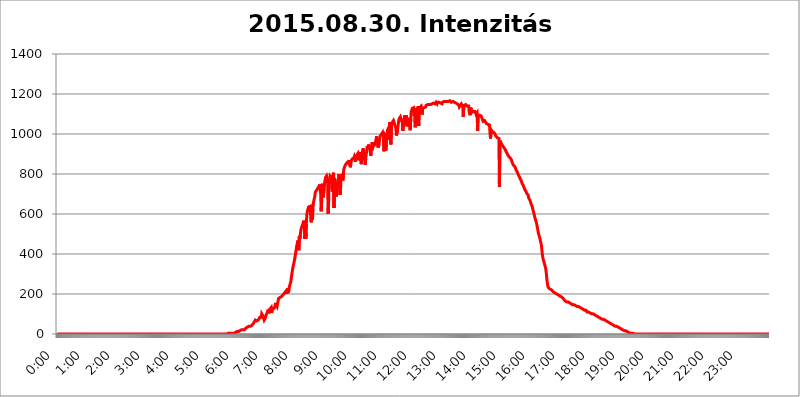
| Category | 2015.08.30. Intenzitás [W/m^2] |
|---|---|
| 0.0 | 0 |
| 0.0006944444444444445 | 0 |
| 0.001388888888888889 | 0 |
| 0.0020833333333333333 | 0 |
| 0.002777777777777778 | 0 |
| 0.003472222222222222 | 0 |
| 0.004166666666666667 | 0 |
| 0.004861111111111111 | 0 |
| 0.005555555555555556 | 0 |
| 0.0062499999999999995 | 0 |
| 0.006944444444444444 | 0 |
| 0.007638888888888889 | 0 |
| 0.008333333333333333 | 0 |
| 0.009027777777777779 | 0 |
| 0.009722222222222222 | 0 |
| 0.010416666666666666 | 0 |
| 0.011111111111111112 | 0 |
| 0.011805555555555555 | 0 |
| 0.012499999999999999 | 0 |
| 0.013194444444444444 | 0 |
| 0.013888888888888888 | 0 |
| 0.014583333333333332 | 0 |
| 0.015277777777777777 | 0 |
| 0.015972222222222224 | 0 |
| 0.016666666666666666 | 0 |
| 0.017361111111111112 | 0 |
| 0.018055555555555557 | 0 |
| 0.01875 | 0 |
| 0.019444444444444445 | 0 |
| 0.02013888888888889 | 0 |
| 0.020833333333333332 | 0 |
| 0.02152777777777778 | 0 |
| 0.022222222222222223 | 0 |
| 0.02291666666666667 | 0 |
| 0.02361111111111111 | 0 |
| 0.024305555555555556 | 0 |
| 0.024999999999999998 | 0 |
| 0.025694444444444447 | 0 |
| 0.02638888888888889 | 0 |
| 0.027083333333333334 | 0 |
| 0.027777777777777776 | 0 |
| 0.02847222222222222 | 0 |
| 0.029166666666666664 | 0 |
| 0.029861111111111113 | 0 |
| 0.030555555555555555 | 0 |
| 0.03125 | 0 |
| 0.03194444444444445 | 0 |
| 0.03263888888888889 | 0 |
| 0.03333333333333333 | 0 |
| 0.034027777777777775 | 0 |
| 0.034722222222222224 | 0 |
| 0.035416666666666666 | 0 |
| 0.036111111111111115 | 0 |
| 0.03680555555555556 | 0 |
| 0.0375 | 0 |
| 0.03819444444444444 | 0 |
| 0.03888888888888889 | 0 |
| 0.03958333333333333 | 0 |
| 0.04027777777777778 | 0 |
| 0.04097222222222222 | 0 |
| 0.041666666666666664 | 0 |
| 0.042361111111111106 | 0 |
| 0.04305555555555556 | 0 |
| 0.043750000000000004 | 0 |
| 0.044444444444444446 | 0 |
| 0.04513888888888889 | 0 |
| 0.04583333333333334 | 0 |
| 0.04652777777777778 | 0 |
| 0.04722222222222222 | 0 |
| 0.04791666666666666 | 0 |
| 0.04861111111111111 | 0 |
| 0.049305555555555554 | 0 |
| 0.049999999999999996 | 0 |
| 0.05069444444444445 | 0 |
| 0.051388888888888894 | 0 |
| 0.052083333333333336 | 0 |
| 0.05277777777777778 | 0 |
| 0.05347222222222222 | 0 |
| 0.05416666666666667 | 0 |
| 0.05486111111111111 | 0 |
| 0.05555555555555555 | 0 |
| 0.05625 | 0 |
| 0.05694444444444444 | 0 |
| 0.057638888888888885 | 0 |
| 0.05833333333333333 | 0 |
| 0.05902777777777778 | 0 |
| 0.059722222222222225 | 0 |
| 0.06041666666666667 | 0 |
| 0.061111111111111116 | 0 |
| 0.06180555555555556 | 0 |
| 0.0625 | 0 |
| 0.06319444444444444 | 0 |
| 0.06388888888888888 | 0 |
| 0.06458333333333334 | 0 |
| 0.06527777777777778 | 0 |
| 0.06597222222222222 | 0 |
| 0.06666666666666667 | 0 |
| 0.06736111111111111 | 0 |
| 0.06805555555555555 | 0 |
| 0.06874999999999999 | 0 |
| 0.06944444444444443 | 0 |
| 0.07013888888888889 | 0 |
| 0.07083333333333333 | 0 |
| 0.07152777777777779 | 0 |
| 0.07222222222222223 | 0 |
| 0.07291666666666667 | 0 |
| 0.07361111111111111 | 0 |
| 0.07430555555555556 | 0 |
| 0.075 | 0 |
| 0.07569444444444444 | 0 |
| 0.0763888888888889 | 0 |
| 0.07708333333333334 | 0 |
| 0.07777777777777778 | 0 |
| 0.07847222222222222 | 0 |
| 0.07916666666666666 | 0 |
| 0.0798611111111111 | 0 |
| 0.08055555555555556 | 0 |
| 0.08125 | 0 |
| 0.08194444444444444 | 0 |
| 0.08263888888888889 | 0 |
| 0.08333333333333333 | 0 |
| 0.08402777777777777 | 0 |
| 0.08472222222222221 | 0 |
| 0.08541666666666665 | 0 |
| 0.08611111111111112 | 0 |
| 0.08680555555555557 | 0 |
| 0.08750000000000001 | 0 |
| 0.08819444444444445 | 0 |
| 0.08888888888888889 | 0 |
| 0.08958333333333333 | 0 |
| 0.09027777777777778 | 0 |
| 0.09097222222222222 | 0 |
| 0.09166666666666667 | 0 |
| 0.09236111111111112 | 0 |
| 0.09305555555555556 | 0 |
| 0.09375 | 0 |
| 0.09444444444444444 | 0 |
| 0.09513888888888888 | 0 |
| 0.09583333333333333 | 0 |
| 0.09652777777777777 | 0 |
| 0.09722222222222222 | 0 |
| 0.09791666666666667 | 0 |
| 0.09861111111111111 | 0 |
| 0.09930555555555555 | 0 |
| 0.09999999999999999 | 0 |
| 0.10069444444444443 | 0 |
| 0.1013888888888889 | 0 |
| 0.10208333333333335 | 0 |
| 0.10277777777777779 | 0 |
| 0.10347222222222223 | 0 |
| 0.10416666666666667 | 0 |
| 0.10486111111111111 | 0 |
| 0.10555555555555556 | 0 |
| 0.10625 | 0 |
| 0.10694444444444444 | 0 |
| 0.1076388888888889 | 0 |
| 0.10833333333333334 | 0 |
| 0.10902777777777778 | 0 |
| 0.10972222222222222 | 0 |
| 0.1111111111111111 | 0 |
| 0.11180555555555556 | 0 |
| 0.11180555555555556 | 0 |
| 0.1125 | 0 |
| 0.11319444444444444 | 0 |
| 0.11388888888888889 | 0 |
| 0.11458333333333333 | 0 |
| 0.11527777777777777 | 0 |
| 0.11597222222222221 | 0 |
| 0.11666666666666665 | 0 |
| 0.1173611111111111 | 0 |
| 0.11805555555555557 | 0 |
| 0.11944444444444445 | 0 |
| 0.12013888888888889 | 0 |
| 0.12083333333333333 | 0 |
| 0.12152777777777778 | 0 |
| 0.12222222222222223 | 0 |
| 0.12291666666666667 | 0 |
| 0.12291666666666667 | 0 |
| 0.12361111111111112 | 0 |
| 0.12430555555555556 | 0 |
| 0.125 | 0 |
| 0.12569444444444444 | 0 |
| 0.12638888888888888 | 0 |
| 0.12708333333333333 | 0 |
| 0.16875 | 0 |
| 0.12847222222222224 | 0 |
| 0.12916666666666668 | 0 |
| 0.12986111111111112 | 0 |
| 0.13055555555555556 | 0 |
| 0.13125 | 0 |
| 0.13194444444444445 | 0 |
| 0.1326388888888889 | 0 |
| 0.13333333333333333 | 0 |
| 0.13402777777777777 | 0 |
| 0.13402777777777777 | 0 |
| 0.13472222222222222 | 0 |
| 0.13541666666666666 | 0 |
| 0.1361111111111111 | 0 |
| 0.13749999999999998 | 0 |
| 0.13819444444444443 | 0 |
| 0.1388888888888889 | 0 |
| 0.13958333333333334 | 0 |
| 0.14027777777777778 | 0 |
| 0.14097222222222222 | 0 |
| 0.14166666666666666 | 0 |
| 0.1423611111111111 | 0 |
| 0.14305555555555557 | 0 |
| 0.14375000000000002 | 0 |
| 0.14444444444444446 | 0 |
| 0.1451388888888889 | 0 |
| 0.1451388888888889 | 0 |
| 0.14652777777777778 | 0 |
| 0.14722222222222223 | 0 |
| 0.14791666666666667 | 0 |
| 0.1486111111111111 | 0 |
| 0.14930555555555555 | 0 |
| 0.15 | 0 |
| 0.15069444444444444 | 0 |
| 0.15138888888888888 | 0 |
| 0.15208333333333332 | 0 |
| 0.15277777777777776 | 0 |
| 0.15347222222222223 | 0 |
| 0.15416666666666667 | 0 |
| 0.15486111111111112 | 0 |
| 0.15555555555555556 | 0 |
| 0.15625 | 0 |
| 0.15694444444444444 | 0 |
| 0.15763888888888888 | 0 |
| 0.15833333333333333 | 0 |
| 0.15902777777777777 | 0 |
| 0.15972222222222224 | 0 |
| 0.16041666666666668 | 0 |
| 0.16111111111111112 | 0 |
| 0.16180555555555556 | 0 |
| 0.1625 | 0 |
| 0.16319444444444445 | 0 |
| 0.1638888888888889 | 0 |
| 0.16458333333333333 | 0 |
| 0.16527777777777777 | 0 |
| 0.16597222222222222 | 0 |
| 0.16666666666666666 | 0 |
| 0.1673611111111111 | 0 |
| 0.16805555555555554 | 0 |
| 0.16874999999999998 | 0 |
| 0.16944444444444443 | 0 |
| 0.17013888888888887 | 0 |
| 0.1708333333333333 | 0 |
| 0.17152777777777775 | 0 |
| 0.17222222222222225 | 0 |
| 0.1729166666666667 | 0 |
| 0.17361111111111113 | 0 |
| 0.17430555555555557 | 0 |
| 0.17500000000000002 | 0 |
| 0.17569444444444446 | 0 |
| 0.1763888888888889 | 0 |
| 0.17708333333333334 | 0 |
| 0.17777777777777778 | 0 |
| 0.17847222222222223 | 0 |
| 0.17916666666666667 | 0 |
| 0.1798611111111111 | 0 |
| 0.18055555555555555 | 0 |
| 0.18125 | 0 |
| 0.18194444444444444 | 0 |
| 0.1826388888888889 | 0 |
| 0.18333333333333335 | 0 |
| 0.1840277777777778 | 0 |
| 0.18472222222222223 | 0 |
| 0.18541666666666667 | 0 |
| 0.18611111111111112 | 0 |
| 0.18680555555555556 | 0 |
| 0.1875 | 0 |
| 0.18819444444444444 | 0 |
| 0.18888888888888888 | 0 |
| 0.18958333333333333 | 0 |
| 0.19027777777777777 | 0 |
| 0.1909722222222222 | 0 |
| 0.19166666666666665 | 0 |
| 0.19236111111111112 | 0 |
| 0.19305555555555554 | 0 |
| 0.19375 | 0 |
| 0.19444444444444445 | 0 |
| 0.1951388888888889 | 0 |
| 0.19583333333333333 | 0 |
| 0.19652777777777777 | 0 |
| 0.19722222222222222 | 0 |
| 0.19791666666666666 | 0 |
| 0.1986111111111111 | 0 |
| 0.19930555555555554 | 0 |
| 0.19999999999999998 | 0 |
| 0.20069444444444443 | 0 |
| 0.20138888888888887 | 0 |
| 0.2020833333333333 | 0 |
| 0.2027777777777778 | 0 |
| 0.2034722222222222 | 0 |
| 0.2041666666666667 | 0 |
| 0.20486111111111113 | 0 |
| 0.20555555555555557 | 0 |
| 0.20625000000000002 | 0 |
| 0.20694444444444446 | 0 |
| 0.2076388888888889 | 0 |
| 0.20833333333333334 | 0 |
| 0.20902777777777778 | 0 |
| 0.20972222222222223 | 0 |
| 0.21041666666666667 | 0 |
| 0.2111111111111111 | 0 |
| 0.21180555555555555 | 0 |
| 0.2125 | 0 |
| 0.21319444444444444 | 0 |
| 0.2138888888888889 | 0 |
| 0.21458333333333335 | 0 |
| 0.2152777777777778 | 0 |
| 0.21597222222222223 | 0 |
| 0.21666666666666667 | 0 |
| 0.21736111111111112 | 0 |
| 0.21805555555555556 | 0 |
| 0.21875 | 0 |
| 0.21944444444444444 | 0 |
| 0.22013888888888888 | 0 |
| 0.22083333333333333 | 0 |
| 0.22152777777777777 | 0 |
| 0.2222222222222222 | 0 |
| 0.22291666666666665 | 0 |
| 0.2236111111111111 | 0 |
| 0.22430555555555556 | 0 |
| 0.225 | 0 |
| 0.22569444444444445 | 0 |
| 0.2263888888888889 | 0 |
| 0.22708333333333333 | 0 |
| 0.22777777777777777 | 0 |
| 0.22847222222222222 | 0 |
| 0.22916666666666666 | 0 |
| 0.2298611111111111 | 0 |
| 0.23055555555555554 | 0 |
| 0.23124999999999998 | 0 |
| 0.23194444444444443 | 0 |
| 0.23263888888888887 | 0 |
| 0.2333333333333333 | 0 |
| 0.2340277777777778 | 0 |
| 0.2347222222222222 | 0 |
| 0.2354166666666667 | 0 |
| 0.23611111111111113 | 0 |
| 0.23680555555555557 | 0 |
| 0.23750000000000002 | 0 |
| 0.23819444444444446 | 0 |
| 0.2388888888888889 | 3.525 |
| 0.23958333333333334 | 3.525 |
| 0.24027777777777778 | 3.525 |
| 0.24097222222222223 | 3.525 |
| 0.24166666666666667 | 3.525 |
| 0.2423611111111111 | 3.525 |
| 0.24305555555555555 | 3.525 |
| 0.24375 | 3.525 |
| 0.24444444444444446 | 3.525 |
| 0.24513888888888888 | 3.525 |
| 0.24583333333333335 | 3.525 |
| 0.2465277777777778 | 3.525 |
| 0.24722222222222223 | 3.525 |
| 0.24791666666666667 | 3.525 |
| 0.24861111111111112 | 7.887 |
| 0.24930555555555556 | 7.887 |
| 0.25 | 7.887 |
| 0.25069444444444444 | 7.887 |
| 0.2513888888888889 | 12.257 |
| 0.2520833333333333 | 12.257 |
| 0.25277777777777777 | 12.257 |
| 0.2534722222222222 | 12.257 |
| 0.25416666666666665 | 12.257 |
| 0.2548611111111111 | 16.636 |
| 0.2555555555555556 | 16.636 |
| 0.25625000000000003 | 16.636 |
| 0.2569444444444445 | 16.636 |
| 0.2576388888888889 | 16.636 |
| 0.25833333333333336 | 21.024 |
| 0.2590277777777778 | 21.024 |
| 0.25972222222222224 | 21.024 |
| 0.2604166666666667 | 21.024 |
| 0.2611111111111111 | 21.024 |
| 0.26180555555555557 | 21.024 |
| 0.2625 | 21.024 |
| 0.26319444444444445 | 25.419 |
| 0.2638888888888889 | 25.419 |
| 0.26458333333333334 | 29.823 |
| 0.2652777777777778 | 29.823 |
| 0.2659722222222222 | 29.823 |
| 0.26666666666666666 | 34.234 |
| 0.2673611111111111 | 34.234 |
| 0.26805555555555555 | 34.234 |
| 0.26875 | 38.653 |
| 0.26944444444444443 | 38.653 |
| 0.2701388888888889 | 38.653 |
| 0.2708333333333333 | 38.653 |
| 0.27152777777777776 | 38.653 |
| 0.2722222222222222 | 43.079 |
| 0.27291666666666664 | 43.079 |
| 0.2736111111111111 | 43.079 |
| 0.2743055555555555 | 47.511 |
| 0.27499999999999997 | 51.951 |
| 0.27569444444444446 | 56.398 |
| 0.27638888888888885 | 60.85 |
| 0.27708333333333335 | 65.31 |
| 0.2777777777777778 | 69.775 |
| 0.27847222222222223 | 69.775 |
| 0.2791666666666667 | 65.31 |
| 0.2798611111111111 | 65.31 |
| 0.28055555555555556 | 65.31 |
| 0.28125 | 65.31 |
| 0.28194444444444444 | 69.775 |
| 0.2826388888888889 | 74.246 |
| 0.2833333333333333 | 74.246 |
| 0.28402777777777777 | 83.205 |
| 0.2847222222222222 | 87.692 |
| 0.28541666666666665 | 83.205 |
| 0.28611111111111115 | 83.205 |
| 0.28680555555555554 | 101.184 |
| 0.28750000000000003 | 101.184 |
| 0.2881944444444445 | 101.184 |
| 0.2888888888888889 | 87.692 |
| 0.28958333333333336 | 83.205 |
| 0.2902777777777778 | 69.775 |
| 0.29097222222222224 | 74.246 |
| 0.2916666666666667 | 78.722 |
| 0.2923611111111111 | 83.205 |
| 0.29305555555555557 | 96.682 |
| 0.29375 | 101.184 |
| 0.29444444444444445 | 105.69 |
| 0.2951388888888889 | 114.716 |
| 0.29583333333333334 | 114.716 |
| 0.2965277777777778 | 114.716 |
| 0.2972222222222222 | 110.201 |
| 0.29791666666666666 | 123.758 |
| 0.2986111111111111 | 128.284 |
| 0.29930555555555555 | 128.284 |
| 0.3 | 132.814 |
| 0.30069444444444443 | 105.69 |
| 0.3013888888888889 | 114.716 |
| 0.3020833333333333 | 128.284 |
| 0.30277777777777776 | 128.284 |
| 0.3034722222222222 | 132.814 |
| 0.30416666666666664 | 128.284 |
| 0.3048611111111111 | 128.284 |
| 0.3055555555555555 | 141.884 |
| 0.30624999999999997 | 155.509 |
| 0.3069444444444444 | 146.423 |
| 0.3076388888888889 | 146.423 |
| 0.30833333333333335 | 137.347 |
| 0.3090277777777778 | 150.964 |
| 0.30972222222222223 | 164.605 |
| 0.3104166666666667 | 178.264 |
| 0.3111111111111111 | 182.82 |
| 0.31180555555555556 | 182.82 |
| 0.3125 | 182.82 |
| 0.31319444444444444 | 187.378 |
| 0.3138888888888889 | 187.378 |
| 0.3145833333333333 | 187.378 |
| 0.31527777777777777 | 187.378 |
| 0.3159722222222222 | 187.378 |
| 0.31666666666666665 | 196.497 |
| 0.31736111111111115 | 196.497 |
| 0.31805555555555554 | 201.058 |
| 0.31875000000000003 | 205.62 |
| 0.3194444444444445 | 205.62 |
| 0.3201388888888889 | 210.182 |
| 0.32083333333333336 | 214.746 |
| 0.3215277777777778 | 214.746 |
| 0.32222222222222224 | 201.058 |
| 0.3229166666666667 | 228.436 |
| 0.3236111111111111 | 223.873 |
| 0.32430555555555557 | 205.62 |
| 0.325 | 228.436 |
| 0.32569444444444445 | 237.564 |
| 0.3263888888888889 | 242.127 |
| 0.32708333333333334 | 255.813 |
| 0.3277777777777778 | 264.932 |
| 0.3284722222222222 | 287.709 |
| 0.32916666666666666 | 301.354 |
| 0.3298611111111111 | 319.517 |
| 0.33055555555555555 | 333.113 |
| 0.33125 | 333.113 |
| 0.33194444444444443 | 355.712 |
| 0.3326388888888889 | 369.23 |
| 0.3333333333333333 | 382.715 |
| 0.3340277777777778 | 396.164 |
| 0.3347222222222222 | 414.035 |
| 0.3354166666666667 | 427.39 |
| 0.3361111111111111 | 445.129 |
| 0.3368055555555556 | 453.968 |
| 0.33749999999999997 | 467.187 |
| 0.33819444444444446 | 427.39 |
| 0.33888888888888885 | 418.492 |
| 0.33958333333333335 | 489.108 |
| 0.34027777777777773 | 475.972 |
| 0.34097222222222223 | 497.836 |
| 0.3416666666666666 | 519.555 |
| 0.3423611111111111 | 528.2 |
| 0.3430555555555555 | 536.82 |
| 0.34375 | 541.121 |
| 0.3444444444444445 | 549.704 |
| 0.3451388888888889 | 558.261 |
| 0.3458333333333334 | 566.793 |
| 0.34652777777777777 | 536.82 |
| 0.34722222222222227 | 475.972 |
| 0.34791666666666665 | 562.53 |
| 0.34861111111111115 | 475.972 |
| 0.34930555555555554 | 549.704 |
| 0.35000000000000003 | 592.233 |
| 0.3506944444444444 | 613.252 |
| 0.3513888888888889 | 621.613 |
| 0.3520833333333333 | 629.948 |
| 0.3527777777777778 | 638.256 |
| 0.3534722222222222 | 613.252 |
| 0.3541666666666667 | 642.4 |
| 0.3548611111111111 | 625.784 |
| 0.35555555555555557 | 583.779 |
| 0.35625 | 558.261 |
| 0.35694444444444445 | 646.537 |
| 0.3576388888888889 | 571.049 |
| 0.35833333333333334 | 592.233 |
| 0.3590277777777778 | 650.667 |
| 0.3597222222222222 | 663.019 |
| 0.36041666666666666 | 675.311 |
| 0.3611111111111111 | 683.473 |
| 0.36180555555555555 | 707.8 |
| 0.3625 | 711.832 |
| 0.36319444444444443 | 711.832 |
| 0.3638888888888889 | 719.877 |
| 0.3645833333333333 | 723.889 |
| 0.3652777777777778 | 727.896 |
| 0.3659722222222222 | 731.896 |
| 0.3666666666666667 | 735.89 |
| 0.3673611111111111 | 739.877 |
| 0.3680555555555556 | 747.834 |
| 0.36874999999999997 | 751.803 |
| 0.36944444444444446 | 703.762 |
| 0.37013888888888885 | 613.252 |
| 0.37083333333333335 | 658.909 |
| 0.37152777777777773 | 735.89 |
| 0.37222222222222223 | 751.803 |
| 0.3729166666666666 | 683.473 |
| 0.3736111111111111 | 683.473 |
| 0.3743055555555555 | 727.896 |
| 0.375 | 755.766 |
| 0.3756944444444445 | 771.559 |
| 0.3763888888888889 | 783.342 |
| 0.3770833333333334 | 783.342 |
| 0.37777777777777777 | 791.169 |
| 0.37847222222222227 | 791.169 |
| 0.37916666666666665 | 771.559 |
| 0.37986111111111115 | 600.661 |
| 0.38055555555555554 | 654.791 |
| 0.38125000000000003 | 747.834 |
| 0.3819444444444444 | 759.723 |
| 0.3826388888888889 | 787.258 |
| 0.3833333333333333 | 791.169 |
| 0.3840277777777778 | 779.42 |
| 0.3847222222222222 | 795.074 |
| 0.3854166666666667 | 727.896 |
| 0.3861111111111111 | 711.832 |
| 0.38680555555555557 | 783.342 |
| 0.3875 | 806.757 |
| 0.38819444444444445 | 629.948 |
| 0.3888888888888889 | 779.42 |
| 0.38958333333333334 | 767.62 |
| 0.3902777777777778 | 771.559 |
| 0.3909722222222222 | 743.859 |
| 0.39166666666666666 | 687.544 |
| 0.3923611111111111 | 715.858 |
| 0.39305555555555555 | 735.89 |
| 0.39375 | 767.62 |
| 0.39444444444444443 | 775.492 |
| 0.3951388888888889 | 798.974 |
| 0.3958333333333333 | 763.674 |
| 0.3965277777777778 | 695.666 |
| 0.3972222222222222 | 707.8 |
| 0.3979166666666667 | 771.559 |
| 0.3986111111111111 | 787.258 |
| 0.3993055555555556 | 787.258 |
| 0.39999999999999997 | 795.074 |
| 0.40069444444444446 | 767.62 |
| 0.40138888888888885 | 806.757 |
| 0.40208333333333335 | 826.123 |
| 0.40277777777777773 | 833.834 |
| 0.40347222222222223 | 833.834 |
| 0.4041666666666666 | 845.365 |
| 0.4048611111111111 | 849.199 |
| 0.4055555555555555 | 853.029 |
| 0.40625 | 853.029 |
| 0.4069444444444445 | 856.855 |
| 0.4076388888888889 | 860.676 |
| 0.4083333333333334 | 856.855 |
| 0.40902777777777777 | 853.029 |
| 0.40972222222222227 | 856.855 |
| 0.41041666666666665 | 868.305 |
| 0.41111111111111115 | 833.834 |
| 0.41180555555555554 | 853.029 |
| 0.41250000000000003 | 868.305 |
| 0.4131944444444444 | 868.305 |
| 0.4138888888888889 | 875.918 |
| 0.4145833333333333 | 879.719 |
| 0.4152777777777778 | 879.719 |
| 0.4159722222222222 | 879.719 |
| 0.4166666666666667 | 887.309 |
| 0.4173611111111111 | 879.719 |
| 0.41805555555555557 | 860.676 |
| 0.41875 | 887.309 |
| 0.41944444444444445 | 883.516 |
| 0.4201388888888889 | 894.885 |
| 0.42083333333333334 | 894.885 |
| 0.4215277777777778 | 902.447 |
| 0.4222222222222222 | 902.447 |
| 0.42291666666666666 | 868.305 |
| 0.4236111111111111 | 872.114 |
| 0.42430555555555555 | 891.099 |
| 0.425 | 909.996 |
| 0.42569444444444443 | 891.099 |
| 0.4263888888888889 | 849.199 |
| 0.4270833333333333 | 902.447 |
| 0.4277777777777778 | 894.885 |
| 0.4284722222222222 | 917.534 |
| 0.4291666666666667 | 928.819 |
| 0.4298611111111111 | 928.819 |
| 0.4305555555555556 | 883.516 |
| 0.43124999999999997 | 864.493 |
| 0.43194444444444446 | 845.365 |
| 0.43263888888888885 | 875.918 |
| 0.43333333333333335 | 902.447 |
| 0.43402777777777773 | 909.996 |
| 0.43472222222222223 | 940.082 |
| 0.4354166666666666 | 932.576 |
| 0.4361111111111111 | 936.33 |
| 0.4368055555555555 | 947.58 |
| 0.4375 | 932.576 |
| 0.4381944444444445 | 928.819 |
| 0.4388888888888889 | 925.06 |
| 0.4395833333333334 | 891.099 |
| 0.44027777777777777 | 902.447 |
| 0.44097222222222227 | 940.082 |
| 0.44166666666666665 | 958.814 |
| 0.44236111111111115 | 958.814 |
| 0.44305555555555554 | 936.33 |
| 0.44375000000000003 | 943.832 |
| 0.4444444444444444 | 940.082 |
| 0.4451388888888889 | 947.58 |
| 0.4458333333333333 | 947.58 |
| 0.4465277777777778 | 962.555 |
| 0.4472222222222222 | 966.295 |
| 0.4479166666666667 | 988.714 |
| 0.4486111111111111 | 951.327 |
| 0.44930555555555557 | 958.814 |
| 0.45 | 932.576 |
| 0.45069444444444445 | 932.576 |
| 0.4513888888888889 | 947.58 |
| 0.45208333333333334 | 973.772 |
| 0.4527777777777778 | 988.714 |
| 0.4534722222222222 | 992.448 |
| 0.45416666666666666 | 984.98 |
| 0.4548611111111111 | 999.916 |
| 0.45555555555555555 | 999.916 |
| 0.45625 | 1007.383 |
| 0.45694444444444443 | 988.714 |
| 0.4576388888888889 | 1011.118 |
| 0.4583333333333333 | 913.766 |
| 0.4590277777777778 | 1003.65 |
| 0.4597222222222222 | 999.916 |
| 0.4604166666666667 | 936.33 |
| 0.4611111111111111 | 917.534 |
| 0.4618055555555556 | 996.182 |
| 0.46249999999999997 | 999.916 |
| 0.46319444444444446 | 1014.852 |
| 0.46388888888888885 | 1007.383 |
| 0.46458333333333335 | 1029.798 |
| 0.46527777777777773 | 1022.323 |
| 0.46597222222222223 | 970.034 |
| 0.4666666666666666 | 1059.756 |
| 0.4673611111111111 | 970.034 |
| 0.4680555555555555 | 947.58 |
| 0.46875 | 1037.277 |
| 0.4694444444444445 | 1052.255 |
| 0.4701388888888889 | 1059.756 |
| 0.4708333333333334 | 1059.756 |
| 0.47152777777777777 | 1067.267 |
| 0.47222222222222227 | 1059.756 |
| 0.47291666666666665 | 1052.255 |
| 0.47361111111111115 | 1052.255 |
| 0.47430555555555554 | 1048.508 |
| 0.47500000000000003 | 1029.798 |
| 0.4756944444444444 | 992.448 |
| 0.4763888888888889 | 988.714 |
| 0.4770833333333333 | 1014.852 |
| 0.4777777777777778 | 1037.277 |
| 0.4784722222222222 | 1033.537 |
| 0.4791666666666667 | 1071.027 |
| 0.4798611111111111 | 1078.555 |
| 0.48055555555555557 | 1078.555 |
| 0.48125 | 1086.097 |
| 0.48194444444444445 | 1082.324 |
| 0.4826388888888889 | 1071.027 |
| 0.48333333333333334 | 1071.027 |
| 0.4840277777777778 | 1056.004 |
| 0.4847222222222222 | 1014.852 |
| 0.48541666666666666 | 1052.255 |
| 0.4861111111111111 | 1037.277 |
| 0.48680555555555555 | 1078.555 |
| 0.4875 | 1093.653 |
| 0.48819444444444443 | 1044.762 |
| 0.4888888888888889 | 1059.756 |
| 0.4895833333333333 | 1093.653 |
| 0.4902777777777778 | 1071.027 |
| 0.4909722222222222 | 1059.756 |
| 0.4916666666666667 | 1037.277 |
| 0.4923611111111111 | 1037.277 |
| 0.4930555555555556 | 1059.756 |
| 0.49374999999999997 | 1052.255 |
| 0.49444444444444446 | 1029.798 |
| 0.49513888888888885 | 1018.587 |
| 0.49583333333333335 | 1078.555 |
| 0.49652777777777773 | 1116.426 |
| 0.49722222222222223 | 1105.019 |
| 0.4979166666666666 | 1127.879 |
| 0.4986111111111111 | 1127.879 |
| 0.4993055555555555 | 1127.879 |
| 0.5 | 1131.708 |
| 0.5006944444444444 | 1089.873 |
| 0.5013888888888889 | 1127.879 |
| 0.5020833333333333 | 1033.537 |
| 0.5027777777777778 | 1067.267 |
| 0.5034722222222222 | 1101.226 |
| 0.5041666666666667 | 1108.816 |
| 0.5048611111111111 | 1127.879 |
| 0.5055555555555555 | 1108.816 |
| 0.50625 | 1139.384 |
| 0.5069444444444444 | 1041.019 |
| 0.5076388888888889 | 1124.056 |
| 0.5083333333333333 | 1131.708 |
| 0.5090277777777777 | 1131.708 |
| 0.5097222222222222 | 1131.708 |
| 0.5104166666666666 | 1139.384 |
| 0.5111111111111112 | 1127.879 |
| 0.5118055555555555 | 1097.437 |
| 0.5125000000000001 | 1127.879 |
| 0.5131944444444444 | 1131.708 |
| 0.513888888888889 | 1131.708 |
| 0.5145833333333333 | 1131.708 |
| 0.5152777777777778 | 1127.879 |
| 0.5159722222222222 | 1127.879 |
| 0.5166666666666667 | 1135.543 |
| 0.517361111111111 | 1143.232 |
| 0.5180555555555556 | 1143.232 |
| 0.5187499999999999 | 1147.086 |
| 0.5194444444444445 | 1147.086 |
| 0.5201388888888888 | 1147.086 |
| 0.5208333333333334 | 1147.086 |
| 0.5215277777777778 | 1147.086 |
| 0.5222222222222223 | 1147.086 |
| 0.5229166666666667 | 1147.086 |
| 0.5236111111111111 | 1147.086 |
| 0.5243055555555556 | 1147.086 |
| 0.525 | 1147.086 |
| 0.5256944444444445 | 1150.946 |
| 0.5263888888888889 | 1150.946 |
| 0.5270833333333333 | 1154.814 |
| 0.5277777777777778 | 1154.814 |
| 0.5284722222222222 | 1154.814 |
| 0.5291666666666667 | 1154.814 |
| 0.5298611111111111 | 1150.946 |
| 0.5305555555555556 | 1154.814 |
| 0.53125 | 1158.689 |
| 0.5319444444444444 | 1158.689 |
| 0.5326388888888889 | 1150.946 |
| 0.5333333333333333 | 1158.689 |
| 0.5340277777777778 | 1154.814 |
| 0.5347222222222222 | 1154.814 |
| 0.5354166666666667 | 1158.689 |
| 0.5361111111111111 | 1154.814 |
| 0.5368055555555555 | 1154.814 |
| 0.5375 | 1154.814 |
| 0.5381944444444444 | 1154.814 |
| 0.5388888888888889 | 1150.946 |
| 0.5395833333333333 | 1150.946 |
| 0.5402777777777777 | 1158.689 |
| 0.5409722222222222 | 1162.571 |
| 0.5416666666666666 | 1162.571 |
| 0.5423611111111112 | 1162.571 |
| 0.5430555555555555 | 1162.571 |
| 0.5437500000000001 | 1162.571 |
| 0.5444444444444444 | 1162.571 |
| 0.545138888888889 | 1162.571 |
| 0.5458333333333333 | 1162.571 |
| 0.5465277777777778 | 1162.571 |
| 0.5472222222222222 | 1162.571 |
| 0.5479166666666667 | 1162.571 |
| 0.548611111111111 | 1162.571 |
| 0.5493055555555556 | 1166.46 |
| 0.5499999999999999 | 1162.571 |
| 0.5506944444444445 | 1166.46 |
| 0.5513888888888888 | 1162.571 |
| 0.5520833333333334 | 1162.571 |
| 0.5527777777777778 | 1158.689 |
| 0.5534722222222223 | 1162.571 |
| 0.5541666666666667 | 1162.571 |
| 0.5548611111111111 | 1162.571 |
| 0.5555555555555556 | 1162.571 |
| 0.55625 | 1158.689 |
| 0.5569444444444445 | 1158.689 |
| 0.5576388888888889 | 1158.689 |
| 0.5583333333333333 | 1154.814 |
| 0.5590277777777778 | 1154.814 |
| 0.5597222222222222 | 1154.814 |
| 0.5604166666666667 | 1150.946 |
| 0.5611111111111111 | 1150.946 |
| 0.5618055555555556 | 1150.946 |
| 0.5625 | 1147.086 |
| 0.5631944444444444 | 1143.232 |
| 0.5638888888888889 | 1135.543 |
| 0.5645833333333333 | 1139.384 |
| 0.5652777777777778 | 1143.232 |
| 0.5659722222222222 | 1143.232 |
| 0.5666666666666667 | 1150.946 |
| 0.5673611111111111 | 1147.086 |
| 0.5680555555555555 | 1150.946 |
| 0.56875 | 1139.384 |
| 0.5694444444444444 | 1086.097 |
| 0.5701388888888889 | 1131.708 |
| 0.5708333333333333 | 1143.232 |
| 0.5715277777777777 | 1147.086 |
| 0.5722222222222222 | 1147.086 |
| 0.5729166666666666 | 1147.086 |
| 0.5736111111111112 | 1143.232 |
| 0.5743055555555555 | 1143.232 |
| 0.5750000000000001 | 1139.384 |
| 0.5756944444444444 | 1139.384 |
| 0.576388888888889 | 1139.384 |
| 0.5770833333333333 | 1139.384 |
| 0.5777777777777778 | 1108.816 |
| 0.5784722222222222 | 1112.618 |
| 0.5791666666666667 | 1093.653 |
| 0.579861111111111 | 1131.708 |
| 0.5805555555555556 | 1131.708 |
| 0.5812499999999999 | 1116.426 |
| 0.5819444444444445 | 1108.816 |
| 0.5826388888888888 | 1108.816 |
| 0.5833333333333334 | 1108.816 |
| 0.5840277777777778 | 1112.618 |
| 0.5847222222222223 | 1112.618 |
| 0.5854166666666667 | 1116.426 |
| 0.5861111111111111 | 1112.618 |
| 0.5868055555555556 | 1105.019 |
| 0.5875 | 1097.437 |
| 0.5881944444444445 | 1101.226 |
| 0.5888888888888889 | 1105.019 |
| 0.5895833333333333 | 1014.852 |
| 0.5902777777777778 | 1093.653 |
| 0.5909722222222222 | 1097.437 |
| 0.5916666666666667 | 1093.653 |
| 0.5923611111111111 | 1093.653 |
| 0.5930555555555556 | 1093.653 |
| 0.59375 | 1089.873 |
| 0.5944444444444444 | 1089.873 |
| 0.5951388888888889 | 1086.097 |
| 0.5958333333333333 | 1078.555 |
| 0.5965277777777778 | 1074.789 |
| 0.5972222222222222 | 1063.51 |
| 0.5979166666666667 | 1059.756 |
| 0.5986111111111111 | 1059.756 |
| 0.5993055555555555 | 1067.267 |
| 0.6 | 1067.267 |
| 0.6006944444444444 | 1059.756 |
| 0.6013888888888889 | 1056.004 |
| 0.6020833333333333 | 1052.255 |
| 0.6027777777777777 | 1048.508 |
| 0.6034722222222222 | 1048.508 |
| 0.6041666666666666 | 1048.508 |
| 0.6048611111111112 | 1044.762 |
| 0.6055555555555555 | 1044.762 |
| 0.6062500000000001 | 1044.762 |
| 0.6069444444444444 | 1007.383 |
| 0.607638888888889 | 977.508 |
| 0.6083333333333333 | 1007.383 |
| 0.6090277777777778 | 1018.587 |
| 0.6097222222222222 | 1022.323 |
| 0.6104166666666667 | 1011.118 |
| 0.611111111111111 | 1014.852 |
| 0.6118055555555556 | 1014.852 |
| 0.6124999999999999 | 1007.383 |
| 0.6131944444444445 | 1007.383 |
| 0.6138888888888888 | 999.916 |
| 0.6145833333333334 | 999.916 |
| 0.6152777777777778 | 988.714 |
| 0.6159722222222223 | 988.714 |
| 0.6166666666666667 | 984.98 |
| 0.6173611111111111 | 981.244 |
| 0.6180555555555556 | 981.244 |
| 0.61875 | 977.508 |
| 0.6194444444444445 | 977.508 |
| 0.6201388888888889 | 735.89 |
| 0.6208333333333333 | 955.071 |
| 0.6215277777777778 | 966.295 |
| 0.6222222222222222 | 955.071 |
| 0.6229166666666667 | 951.327 |
| 0.6236111111111111 | 947.58 |
| 0.6243055555555556 | 943.832 |
| 0.625 | 943.832 |
| 0.6256944444444444 | 936.33 |
| 0.6263888888888889 | 932.576 |
| 0.6270833333333333 | 928.819 |
| 0.6277777777777778 | 925.06 |
| 0.6284722222222222 | 921.298 |
| 0.6291666666666667 | 913.766 |
| 0.6298611111111111 | 909.996 |
| 0.6305555555555555 | 906.223 |
| 0.63125 | 902.447 |
| 0.6319444444444444 | 894.885 |
| 0.6326388888888889 | 894.885 |
| 0.6333333333333333 | 887.309 |
| 0.6340277777777777 | 883.516 |
| 0.6347222222222222 | 883.516 |
| 0.6354166666666666 | 879.719 |
| 0.6361111111111112 | 879.719 |
| 0.6368055555555555 | 872.114 |
| 0.6375000000000001 | 868.305 |
| 0.6381944444444444 | 856.855 |
| 0.638888888888889 | 853.029 |
| 0.6395833333333333 | 845.365 |
| 0.6402777777777778 | 845.365 |
| 0.6409722222222222 | 841.526 |
| 0.6416666666666667 | 837.682 |
| 0.642361111111111 | 833.834 |
| 0.6430555555555556 | 826.123 |
| 0.6437499999999999 | 818.392 |
| 0.6444444444444445 | 814.519 |
| 0.6451388888888888 | 810.641 |
| 0.6458333333333334 | 810.641 |
| 0.6465277777777778 | 806.757 |
| 0.6472222222222223 | 791.169 |
| 0.6479166666666667 | 787.258 |
| 0.6486111111111111 | 783.342 |
| 0.6493055555555556 | 775.492 |
| 0.65 | 771.559 |
| 0.6506944444444445 | 767.62 |
| 0.6513888888888889 | 759.723 |
| 0.6520833333333333 | 751.803 |
| 0.6527777777777778 | 747.834 |
| 0.6534722222222222 | 743.859 |
| 0.6541666666666667 | 739.877 |
| 0.6548611111111111 | 731.896 |
| 0.6555555555555556 | 723.889 |
| 0.65625 | 723.889 |
| 0.6569444444444444 | 719.877 |
| 0.6576388888888889 | 711.832 |
| 0.6583333333333333 | 703.762 |
| 0.6590277777777778 | 703.762 |
| 0.6597222222222222 | 699.717 |
| 0.6604166666666667 | 695.666 |
| 0.6611111111111111 | 683.473 |
| 0.6618055555555555 | 675.311 |
| 0.6625 | 671.22 |
| 0.6631944444444444 | 667.123 |
| 0.6638888888888889 | 658.909 |
| 0.6645833333333333 | 650.667 |
| 0.6652777777777777 | 646.537 |
| 0.6659722222222222 | 638.256 |
| 0.6666666666666666 | 629.948 |
| 0.6673611111111111 | 617.436 |
| 0.6680555555555556 | 609.062 |
| 0.6687500000000001 | 600.661 |
| 0.6694444444444444 | 588.009 |
| 0.6701388888888888 | 579.542 |
| 0.6708333333333334 | 575.299 |
| 0.6715277777777778 | 562.53 |
| 0.6722222222222222 | 553.986 |
| 0.6729166666666666 | 541.121 |
| 0.6736111111111112 | 528.2 |
| 0.6743055555555556 | 515.223 |
| 0.6749999999999999 | 502.192 |
| 0.6756944444444444 | 493.475 |
| 0.6763888888888889 | 484.735 |
| 0.6770833333333334 | 475.972 |
| 0.6777777777777777 | 462.786 |
| 0.6784722222222223 | 453.968 |
| 0.6791666666666667 | 440.702 |
| 0.6798611111111111 | 414.035 |
| 0.6805555555555555 | 391.685 |
| 0.68125 | 378.224 |
| 0.6819444444444445 | 369.23 |
| 0.6826388888888889 | 360.221 |
| 0.6833333333333332 | 351.198 |
| 0.6840277777777778 | 342.162 |
| 0.6847222222222222 | 333.113 |
| 0.6854166666666667 | 319.517 |
| 0.686111111111111 | 296.808 |
| 0.6868055555555556 | 269.49 |
| 0.6875 | 251.251 |
| 0.6881944444444444 | 237.564 |
| 0.688888888888889 | 233 |
| 0.6895833333333333 | 228.436 |
| 0.6902777777777778 | 228.436 |
| 0.6909722222222222 | 223.873 |
| 0.6916666666666668 | 223.873 |
| 0.6923611111111111 | 219.309 |
| 0.6930555555555555 | 219.309 |
| 0.69375 | 219.309 |
| 0.6944444444444445 | 214.746 |
| 0.6951388888888889 | 214.746 |
| 0.6958333333333333 | 210.182 |
| 0.6965277777777777 | 210.182 |
| 0.6972222222222223 | 210.182 |
| 0.6979166666666666 | 205.62 |
| 0.6986111111111111 | 205.62 |
| 0.6993055555555556 | 201.058 |
| 0.7000000000000001 | 201.058 |
| 0.7006944444444444 | 201.058 |
| 0.7013888888888888 | 196.497 |
| 0.7020833333333334 | 196.497 |
| 0.7027777777777778 | 191.937 |
| 0.7034722222222222 | 191.937 |
| 0.7041666666666666 | 191.937 |
| 0.7048611111111112 | 191.937 |
| 0.7055555555555556 | 187.378 |
| 0.7062499999999999 | 187.378 |
| 0.7069444444444444 | 182.82 |
| 0.7076388888888889 | 182.82 |
| 0.7083333333333334 | 182.82 |
| 0.7090277777777777 | 178.264 |
| 0.7097222222222223 | 178.264 |
| 0.7104166666666667 | 173.709 |
| 0.7111111111111111 | 169.156 |
| 0.7118055555555555 | 169.156 |
| 0.7125 | 164.605 |
| 0.7131944444444445 | 164.605 |
| 0.7138888888888889 | 164.605 |
| 0.7145833333333332 | 160.056 |
| 0.7152777777777778 | 160.056 |
| 0.7159722222222222 | 160.056 |
| 0.7166666666666667 | 160.056 |
| 0.717361111111111 | 155.509 |
| 0.7180555555555556 | 155.509 |
| 0.71875 | 155.509 |
| 0.7194444444444444 | 150.964 |
| 0.720138888888889 | 150.964 |
| 0.7208333333333333 | 150.964 |
| 0.7215277777777778 | 150.964 |
| 0.7222222222222222 | 150.964 |
| 0.7229166666666668 | 146.423 |
| 0.7236111111111111 | 146.423 |
| 0.7243055555555555 | 146.423 |
| 0.725 | 146.423 |
| 0.7256944444444445 | 146.423 |
| 0.7263888888888889 | 146.423 |
| 0.7270833333333333 | 141.884 |
| 0.7277777777777777 | 141.884 |
| 0.7284722222222223 | 141.884 |
| 0.7291666666666666 | 137.347 |
| 0.7298611111111111 | 137.347 |
| 0.7305555555555556 | 137.347 |
| 0.7312500000000001 | 137.347 |
| 0.7319444444444444 | 137.347 |
| 0.7326388888888888 | 132.814 |
| 0.7333333333333334 | 132.814 |
| 0.7340277777777778 | 132.814 |
| 0.7347222222222222 | 128.284 |
| 0.7354166666666666 | 128.284 |
| 0.7361111111111112 | 128.284 |
| 0.7368055555555556 | 128.284 |
| 0.7374999999999999 | 123.758 |
| 0.7381944444444444 | 123.758 |
| 0.7388888888888889 | 123.758 |
| 0.7395833333333334 | 119.235 |
| 0.7402777777777777 | 119.235 |
| 0.7409722222222223 | 119.235 |
| 0.7416666666666667 | 119.235 |
| 0.7423611111111111 | 114.716 |
| 0.7430555555555555 | 110.201 |
| 0.74375 | 114.716 |
| 0.7444444444444445 | 110.201 |
| 0.7451388888888889 | 110.201 |
| 0.7458333333333332 | 110.201 |
| 0.7465277777777778 | 110.201 |
| 0.7472222222222222 | 105.69 |
| 0.7479166666666667 | 105.69 |
| 0.748611111111111 | 105.69 |
| 0.7493055555555556 | 101.184 |
| 0.75 | 101.184 |
| 0.7506944444444444 | 101.184 |
| 0.751388888888889 | 101.184 |
| 0.7520833333333333 | 96.682 |
| 0.7527777777777778 | 96.682 |
| 0.7534722222222222 | 96.682 |
| 0.7541666666666668 | 92.184 |
| 0.7548611111111111 | 92.184 |
| 0.7555555555555555 | 92.184 |
| 0.75625 | 92.184 |
| 0.7569444444444445 | 87.692 |
| 0.7576388888888889 | 87.692 |
| 0.7583333333333333 | 87.692 |
| 0.7590277777777777 | 83.205 |
| 0.7597222222222223 | 83.205 |
| 0.7604166666666666 | 83.205 |
| 0.7611111111111111 | 83.205 |
| 0.7618055555555556 | 78.722 |
| 0.7625000000000001 | 78.722 |
| 0.7631944444444444 | 78.722 |
| 0.7638888888888888 | 74.246 |
| 0.7645833333333334 | 74.246 |
| 0.7652777777777778 | 74.246 |
| 0.7659722222222222 | 74.246 |
| 0.7666666666666666 | 69.775 |
| 0.7673611111111112 | 69.775 |
| 0.7680555555555556 | 69.775 |
| 0.7687499999999999 | 65.31 |
| 0.7694444444444444 | 65.31 |
| 0.7701388888888889 | 65.31 |
| 0.7708333333333334 | 65.31 |
| 0.7715277777777777 | 60.85 |
| 0.7722222222222223 | 60.85 |
| 0.7729166666666667 | 60.85 |
| 0.7736111111111111 | 56.398 |
| 0.7743055555555555 | 56.398 |
| 0.775 | 56.398 |
| 0.7756944444444445 | 56.398 |
| 0.7763888888888889 | 51.951 |
| 0.7770833333333332 | 51.951 |
| 0.7777777777777778 | 51.951 |
| 0.7784722222222222 | 47.511 |
| 0.7791666666666667 | 47.511 |
| 0.779861111111111 | 47.511 |
| 0.7805555555555556 | 43.079 |
| 0.78125 | 43.079 |
| 0.7819444444444444 | 43.079 |
| 0.782638888888889 | 38.653 |
| 0.7833333333333333 | 38.653 |
| 0.7840277777777778 | 38.653 |
| 0.7847222222222222 | 38.653 |
| 0.7854166666666668 | 38.653 |
| 0.7861111111111111 | 34.234 |
| 0.7868055555555555 | 34.234 |
| 0.7875 | 29.823 |
| 0.7881944444444445 | 29.823 |
| 0.7888888888888889 | 29.823 |
| 0.7895833333333333 | 29.823 |
| 0.7902777777777777 | 25.419 |
| 0.7909722222222223 | 25.419 |
| 0.7916666666666666 | 25.419 |
| 0.7923611111111111 | 21.024 |
| 0.7930555555555556 | 21.024 |
| 0.7937500000000001 | 21.024 |
| 0.7944444444444444 | 21.024 |
| 0.7951388888888888 | 16.636 |
| 0.7958333333333334 | 16.636 |
| 0.7965277777777778 | 16.636 |
| 0.7972222222222222 | 16.636 |
| 0.7979166666666666 | 12.257 |
| 0.7986111111111112 | 12.257 |
| 0.7993055555555556 | 12.257 |
| 0.7999999999999999 | 12.257 |
| 0.8006944444444444 | 7.887 |
| 0.8013888888888889 | 7.887 |
| 0.8020833333333334 | 7.887 |
| 0.8027777777777777 | 7.887 |
| 0.8034722222222223 | 3.525 |
| 0.8041666666666667 | 3.525 |
| 0.8048611111111111 | 3.525 |
| 0.8055555555555555 | 3.525 |
| 0.80625 | 3.525 |
| 0.8069444444444445 | 3.525 |
| 0.8076388888888889 | 3.525 |
| 0.8083333333333332 | 3.525 |
| 0.8090277777777778 | 0 |
| 0.8097222222222222 | 0 |
| 0.8104166666666667 | 0 |
| 0.811111111111111 | 0 |
| 0.8118055555555556 | 0 |
| 0.8125 | 0 |
| 0.8131944444444444 | 0 |
| 0.813888888888889 | 0 |
| 0.8145833333333333 | 0 |
| 0.8152777777777778 | 0 |
| 0.8159722222222222 | 0 |
| 0.8166666666666668 | 0 |
| 0.8173611111111111 | 0 |
| 0.8180555555555555 | 0 |
| 0.81875 | 0 |
| 0.8194444444444445 | 0 |
| 0.8201388888888889 | 0 |
| 0.8208333333333333 | 0 |
| 0.8215277777777777 | 0 |
| 0.8222222222222223 | 0 |
| 0.8229166666666666 | 0 |
| 0.8236111111111111 | 0 |
| 0.8243055555555556 | 0 |
| 0.8250000000000001 | 0 |
| 0.8256944444444444 | 0 |
| 0.8263888888888888 | 0 |
| 0.8270833333333334 | 0 |
| 0.8277777777777778 | 0 |
| 0.8284722222222222 | 0 |
| 0.8291666666666666 | 0 |
| 0.8298611111111112 | 0 |
| 0.8305555555555556 | 0 |
| 0.8312499999999999 | 0 |
| 0.8319444444444444 | 0 |
| 0.8326388888888889 | 0 |
| 0.8333333333333334 | 0 |
| 0.8340277777777777 | 0 |
| 0.8347222222222223 | 0 |
| 0.8354166666666667 | 0 |
| 0.8361111111111111 | 0 |
| 0.8368055555555555 | 0 |
| 0.8375 | 0 |
| 0.8381944444444445 | 0 |
| 0.8388888888888889 | 0 |
| 0.8395833333333332 | 0 |
| 0.8402777777777778 | 0 |
| 0.8409722222222222 | 0 |
| 0.8416666666666667 | 0 |
| 0.842361111111111 | 0 |
| 0.8430555555555556 | 0 |
| 0.84375 | 0 |
| 0.8444444444444444 | 0 |
| 0.845138888888889 | 0 |
| 0.8458333333333333 | 0 |
| 0.8465277777777778 | 0 |
| 0.8472222222222222 | 0 |
| 0.8479166666666668 | 0 |
| 0.8486111111111111 | 0 |
| 0.8493055555555555 | 0 |
| 0.85 | 0 |
| 0.8506944444444445 | 0 |
| 0.8513888888888889 | 0 |
| 0.8520833333333333 | 0 |
| 0.8527777777777777 | 0 |
| 0.8534722222222223 | 0 |
| 0.8541666666666666 | 0 |
| 0.8548611111111111 | 0 |
| 0.8555555555555556 | 0 |
| 0.8562500000000001 | 0 |
| 0.8569444444444444 | 0 |
| 0.8576388888888888 | 0 |
| 0.8583333333333334 | 0 |
| 0.8590277777777778 | 0 |
| 0.8597222222222222 | 0 |
| 0.8604166666666666 | 0 |
| 0.8611111111111112 | 0 |
| 0.8618055555555556 | 0 |
| 0.8624999999999999 | 0 |
| 0.8631944444444444 | 0 |
| 0.8638888888888889 | 0 |
| 0.8645833333333334 | 0 |
| 0.8652777777777777 | 0 |
| 0.8659722222222223 | 0 |
| 0.8666666666666667 | 0 |
| 0.8673611111111111 | 0 |
| 0.8680555555555555 | 0 |
| 0.86875 | 0 |
| 0.8694444444444445 | 0 |
| 0.8701388888888889 | 0 |
| 0.8708333333333332 | 0 |
| 0.8715277777777778 | 0 |
| 0.8722222222222222 | 0 |
| 0.8729166666666667 | 0 |
| 0.873611111111111 | 0 |
| 0.8743055555555556 | 0 |
| 0.875 | 0 |
| 0.8756944444444444 | 0 |
| 0.876388888888889 | 0 |
| 0.8770833333333333 | 0 |
| 0.8777777777777778 | 0 |
| 0.8784722222222222 | 0 |
| 0.8791666666666668 | 0 |
| 0.8798611111111111 | 0 |
| 0.8805555555555555 | 0 |
| 0.88125 | 0 |
| 0.8819444444444445 | 0 |
| 0.8826388888888889 | 0 |
| 0.8833333333333333 | 0 |
| 0.8840277777777777 | 0 |
| 0.8847222222222223 | 0 |
| 0.8854166666666666 | 0 |
| 0.8861111111111111 | 0 |
| 0.8868055555555556 | 0 |
| 0.8875000000000001 | 0 |
| 0.8881944444444444 | 0 |
| 0.8888888888888888 | 0 |
| 0.8895833333333334 | 0 |
| 0.8902777777777778 | 0 |
| 0.8909722222222222 | 0 |
| 0.8916666666666666 | 0 |
| 0.8923611111111112 | 0 |
| 0.8930555555555556 | 0 |
| 0.8937499999999999 | 0 |
| 0.8944444444444444 | 0 |
| 0.8951388888888889 | 0 |
| 0.8958333333333334 | 0 |
| 0.8965277777777777 | 0 |
| 0.8972222222222223 | 0 |
| 0.8979166666666667 | 0 |
| 0.8986111111111111 | 0 |
| 0.8993055555555555 | 0 |
| 0.9 | 0 |
| 0.9006944444444445 | 0 |
| 0.9013888888888889 | 0 |
| 0.9020833333333332 | 0 |
| 0.9027777777777778 | 0 |
| 0.9034722222222222 | 0 |
| 0.9041666666666667 | 0 |
| 0.904861111111111 | 0 |
| 0.9055555555555556 | 0 |
| 0.90625 | 0 |
| 0.9069444444444444 | 0 |
| 0.907638888888889 | 0 |
| 0.9083333333333333 | 0 |
| 0.9090277777777778 | 0 |
| 0.9097222222222222 | 0 |
| 0.9104166666666668 | 0 |
| 0.9111111111111111 | 0 |
| 0.9118055555555555 | 0 |
| 0.9125 | 0 |
| 0.9131944444444445 | 0 |
| 0.9138888888888889 | 0 |
| 0.9145833333333333 | 0 |
| 0.9152777777777777 | 0 |
| 0.9159722222222223 | 0 |
| 0.9166666666666666 | 0 |
| 0.9173611111111111 | 0 |
| 0.9180555555555556 | 0 |
| 0.9187500000000001 | 0 |
| 0.9194444444444444 | 0 |
| 0.9201388888888888 | 0 |
| 0.9208333333333334 | 0 |
| 0.9215277777777778 | 0 |
| 0.9222222222222222 | 0 |
| 0.9229166666666666 | 0 |
| 0.9236111111111112 | 0 |
| 0.9243055555555556 | 0 |
| 0.9249999999999999 | 0 |
| 0.9256944444444444 | 0 |
| 0.9263888888888889 | 0 |
| 0.9270833333333334 | 0 |
| 0.9277777777777777 | 0 |
| 0.9284722222222223 | 0 |
| 0.9291666666666667 | 0 |
| 0.9298611111111111 | 0 |
| 0.9305555555555555 | 0 |
| 0.93125 | 0 |
| 0.9319444444444445 | 0 |
| 0.9326388888888889 | 0 |
| 0.9333333333333332 | 0 |
| 0.9340277777777778 | 0 |
| 0.9347222222222222 | 0 |
| 0.9354166666666667 | 0 |
| 0.936111111111111 | 0 |
| 0.9368055555555556 | 0 |
| 0.9375 | 0 |
| 0.9381944444444444 | 0 |
| 0.938888888888889 | 0 |
| 0.9395833333333333 | 0 |
| 0.9402777777777778 | 0 |
| 0.9409722222222222 | 0 |
| 0.9416666666666668 | 0 |
| 0.9423611111111111 | 0 |
| 0.9430555555555555 | 0 |
| 0.94375 | 0 |
| 0.9444444444444445 | 0 |
| 0.9451388888888889 | 0 |
| 0.9458333333333333 | 0 |
| 0.9465277777777777 | 0 |
| 0.9472222222222223 | 0 |
| 0.9479166666666666 | 0 |
| 0.9486111111111111 | 0 |
| 0.9493055555555556 | 0 |
| 0.9500000000000001 | 0 |
| 0.9506944444444444 | 0 |
| 0.9513888888888888 | 0 |
| 0.9520833333333334 | 0 |
| 0.9527777777777778 | 0 |
| 0.9534722222222222 | 0 |
| 0.9541666666666666 | 0 |
| 0.9548611111111112 | 0 |
| 0.9555555555555556 | 0 |
| 0.9562499999999999 | 0 |
| 0.9569444444444444 | 0 |
| 0.9576388888888889 | 0 |
| 0.9583333333333334 | 0 |
| 0.9590277777777777 | 0 |
| 0.9597222222222223 | 0 |
| 0.9604166666666667 | 0 |
| 0.9611111111111111 | 0 |
| 0.9618055555555555 | 0 |
| 0.9625 | 0 |
| 0.9631944444444445 | 0 |
| 0.9638888888888889 | 0 |
| 0.9645833333333332 | 0 |
| 0.9652777777777778 | 0 |
| 0.9659722222222222 | 0 |
| 0.9666666666666667 | 0 |
| 0.967361111111111 | 0 |
| 0.9680555555555556 | 0 |
| 0.96875 | 0 |
| 0.9694444444444444 | 0 |
| 0.970138888888889 | 0 |
| 0.9708333333333333 | 0 |
| 0.9715277777777778 | 0 |
| 0.9722222222222222 | 0 |
| 0.9729166666666668 | 0 |
| 0.9736111111111111 | 0 |
| 0.9743055555555555 | 0 |
| 0.975 | 0 |
| 0.9756944444444445 | 0 |
| 0.9763888888888889 | 0 |
| 0.9770833333333333 | 0 |
| 0.9777777777777777 | 0 |
| 0.9784722222222223 | 0 |
| 0.9791666666666666 | 0 |
| 0.9798611111111111 | 0 |
| 0.9805555555555556 | 0 |
| 0.9812500000000001 | 0 |
| 0.9819444444444444 | 0 |
| 0.9826388888888888 | 0 |
| 0.9833333333333334 | 0 |
| 0.9840277777777778 | 0 |
| 0.9847222222222222 | 0 |
| 0.9854166666666666 | 0 |
| 0.9861111111111112 | 0 |
| 0.9868055555555556 | 0 |
| 0.9874999999999999 | 0 |
| 0.9881944444444444 | 0 |
| 0.9888888888888889 | 0 |
| 0.9895833333333334 | 0 |
| 0.9902777777777777 | 0 |
| 0.9909722222222223 | 0 |
| 0.9916666666666667 | 0 |
| 0.9923611111111111 | 0 |
| 0.9930555555555555 | 0 |
| 0.99375 | 0 |
| 0.9944444444444445 | 0 |
| 0.9951388888888889 | 0 |
| 0.9958333333333332 | 0 |
| 0.9965277777777778 | 0 |
| 0.9972222222222222 | 0 |
| 0.9979166666666667 | 0 |
| 0.998611111111111 | 0 |
| 0.9993055555555556 | 0 |